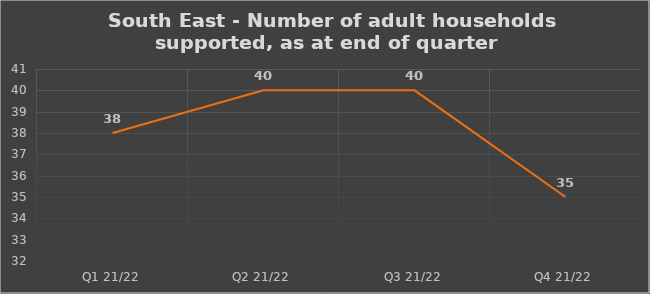
| Category | Number of financially supported households at end of quarter |
|---|---|
| Q1 21/22 | 38 |
| Q2 21/22 | 40 |
| Q3 21/22 | 40 |
| Q4 21/22 | 35 |